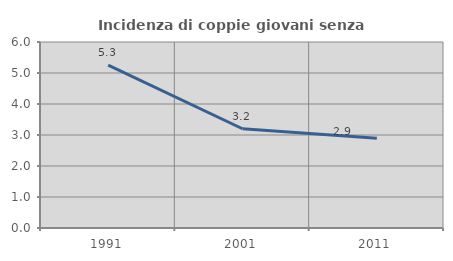
| Category | Incidenza di coppie giovani senza figli |
|---|---|
| 1991.0 | 5.252 |
| 2001.0 | 3.202 |
| 2011.0 | 2.899 |